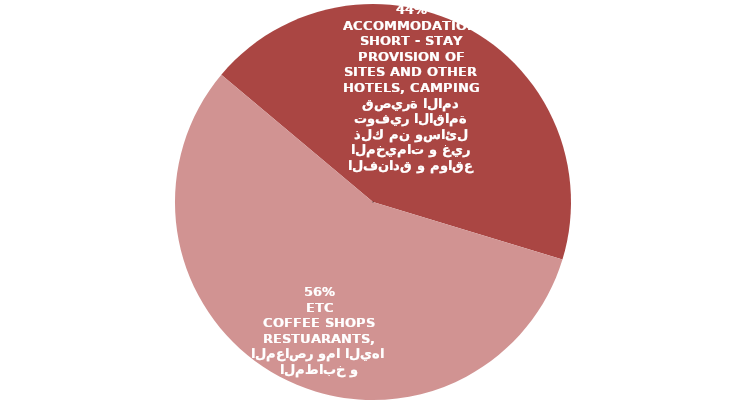
| Category | Series 0 |
|---|---|
| الفنادق و مواقع المخيمات و غير ذلك من وسائل توفير الاقامة قصيرة الامد
HOTELS, CAMPING SITES AND OTHER PROVISION OF SHORT - STAY ACCOMMODATION | 17867 |
| المطاعم و المعاصر و المقاهي و المطابخ و المعاصر وما اليها
RESTUARANTS, COFFEE SHOPS ETC | 23129 |